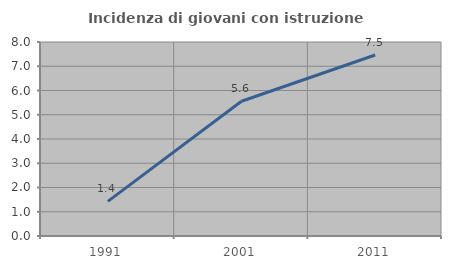
| Category | Incidenza di giovani con istruzione universitaria |
|---|---|
| 1991.0 | 1.429 |
| 2001.0 | 5.556 |
| 2011.0 | 7.463 |